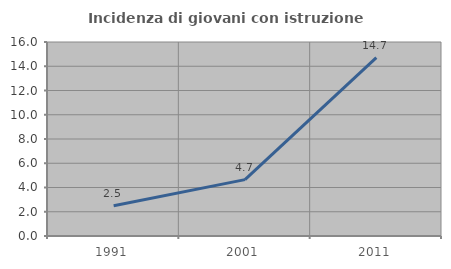
| Category | Incidenza di giovani con istruzione universitaria |
|---|---|
| 1991.0 | 2.5 |
| 2001.0 | 4.651 |
| 2011.0 | 14.719 |